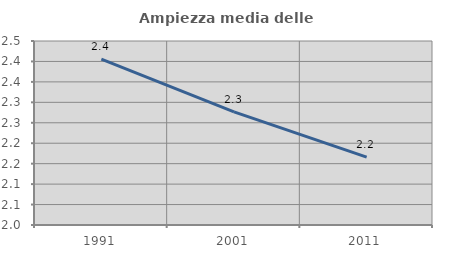
| Category | Ampiezza media delle famiglie |
|---|---|
| 1991.0 | 2.406 |
| 2001.0 | 2.277 |
| 2011.0 | 2.166 |